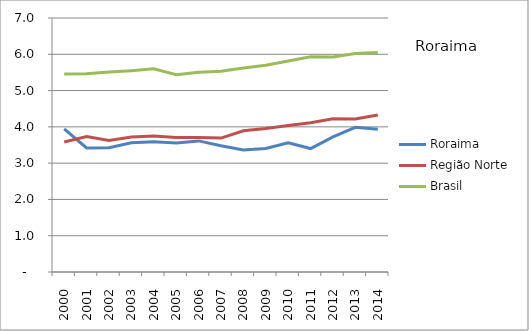
| Category | Roraima | Região Norte | Brasil |
|---|---|---|---|
| 2000.0 | 3.946 | 3.584 | 5.458 |
| 2001.0 | 3.417 | 3.732 | 5.467 |
| 2002.0 | 3.428 | 3.625 | 5.513 |
| 2003.0 | 3.564 | 3.72 | 5.549 |
| 2004.0 | 3.588 | 3.745 | 5.599 |
| 2005.0 | 3.553 | 3.709 | 5.438 |
| 2006.0 | 3.613 | 3.704 | 5.507 |
| 2007.0 | 3.479 | 3.69 | 5.531 |
| 2008.0 | 3.362 | 3.894 | 5.623 |
| 2009.0 | 3.406 | 3.953 | 5.699 |
| 2010.0 | 3.56 | 4.037 | 5.816 |
| 2011.0 | 3.403 | 4.116 | 5.93 |
| 2012.0 | 3.722 | 4.224 | 5.928 |
| 2013.0 | 3.989 | 4.216 | 6.021 |
| 2014.0 | 3.932 | 4.325 | 6.051 |